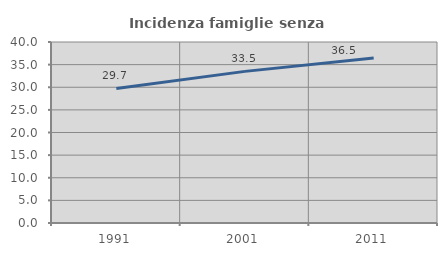
| Category | Incidenza famiglie senza nuclei |
|---|---|
| 1991.0 | 29.732 |
| 2001.0 | 33.507 |
| 2011.0 | 36.466 |